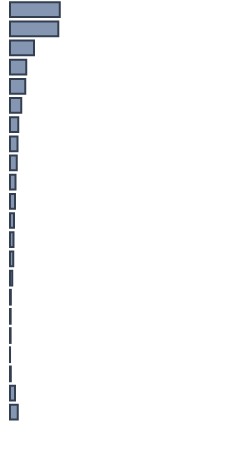
| Category | Series 0 |
|---|---|
| 0 | 21.924 |
| 1 | 21.277 |
| 2 | 10.597 |
| 3 | 7.174 |
| 4 | 6.732 |
| 5 | 4.952 |
| 6 | 3.664 |
| 7 | 3.313 |
| 8 | 3.009 |
| 9 | 2.455 |
| 10 | 2.186 |
| 11 | 1.813 |
| 12 | 1.515 |
| 13 | 1.409 |
| 14 | 1.042 |
| 15 | 0.369 |
| 16 | 0.293 |
| 17 | 0.268 |
| 18 | 0.014 |
| 19 | 0.349 |
| 20 | 2.212 |
| 21 | 3.434 |
| 22 | 0 |